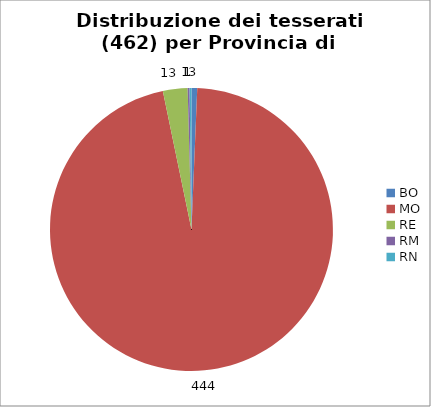
| Category | Nr. Tesserati |
|---|---|
| BO | 3 |
| MO | 444 |
| RE | 13 |
| RM | 1 |
| RN | 1 |